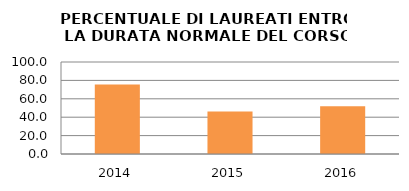
| Category | 2014 2015 2016 |
|---|---|
| 2014.0 | 75.676 |
| 2015.0 | 46.154 |
| 2016.0 | 51.852 |